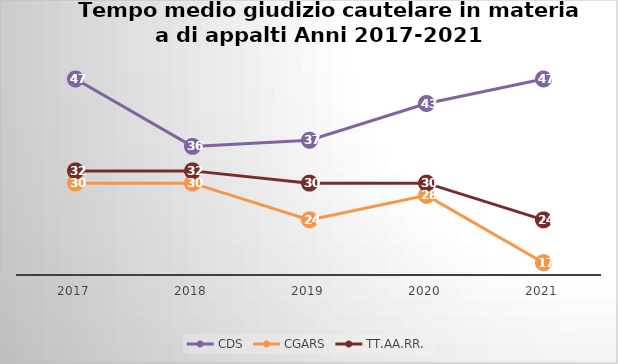
| Category | CDS | CGARS | TT.AA.RR. |
|---|---|---|---|
| 2017.0 | 47 | 30 | 32 |
| 2018.0 | 36 | 30 | 32 |
| 2019.0 | 37 | 24 | 30 |
| 2020.0 | 43 | 28 | 30 |
| 2021.0 | 47 | 17 | 24 |